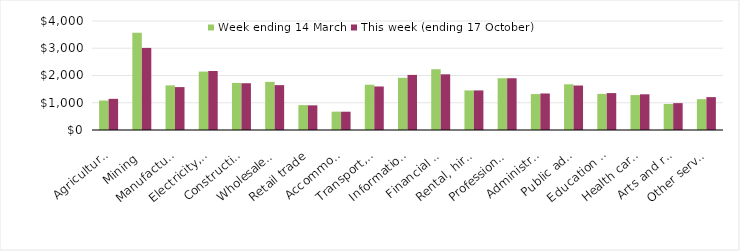
| Category | Week ending 14 March | This week (ending 17 October) |
|---|---|---|
| Agriculture, forestry and fishing | 1081.46 | 1143.38 |
| Mining | 3567.06 | 3012.52 |
| Manufacturing | 1637.64 | 1574.67 |
| Electricity, gas, water and waste services | 2143.98 | 2164.97 |
| Construction | 1726.57 | 1716.35 |
| Wholesale trade | 1766.98 | 1646.37 |
| Retail trade | 913.42 | 904.75 |
| Accommodation and food services | 673.26 | 671.09 |
| Transport, postal and warehousing | 1660.76 | 1597.38 |
| Information media and telecommunications | 1914.79 | 2022.04 |
| Financial and insurance services | 2229.97 | 2043.67 |
| Rental, hiring and real estate services | 1451.84 | 1452.71 |
| Professional, scientific and technical services | 1899.29 | 1899.47 |
| Administrative and support services | 1318.04 | 1340.38 |
| Public administration and safety | 1677.03 | 1632.29 |
| Education and training | 1325.3 | 1354.46 |
| Health care and social assistance | 1281.9 | 1310.1 |
| Arts and recreation services | 957.15 | 986.18 |
| Other services | 1131.46 | 1206.87 |